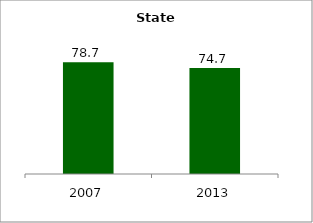
| Category | State |
|---|---|
| 2007.0 | 78.657 |
| 2013.0 | 74.65 |